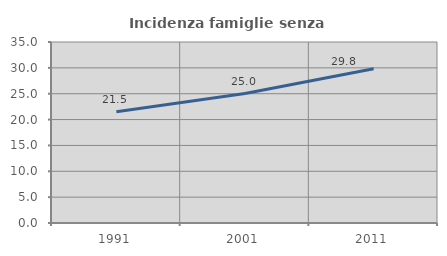
| Category | Incidenza famiglie senza nuclei |
|---|---|
| 1991.0 | 21.533 |
| 2001.0 | 25.032 |
| 2011.0 | 29.834 |